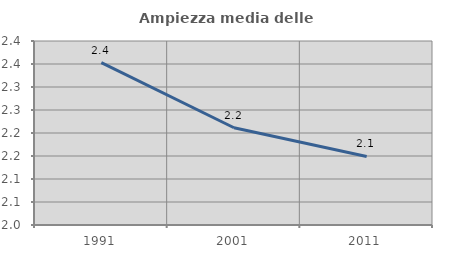
| Category | Ampiezza media delle famiglie |
|---|---|
| 1991.0 | 2.353 |
| 2001.0 | 2.211 |
| 2011.0 | 2.149 |